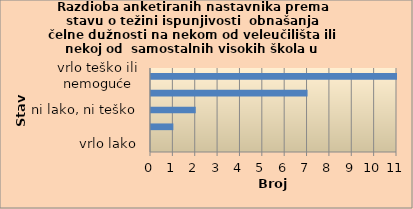
| Category | Series 0 |
|---|---|
| vrlo lako | 0 |
| lako | 1 |
| ni lako, ni teško | 2 |
| teško | 7 |
| vrlo teško ili nemoguće | 11 |